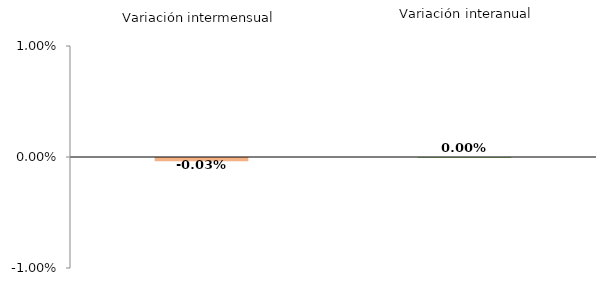
| Category | Series 0 |
|---|---|
| 0 | -0.028 |
| 1 | 0 |